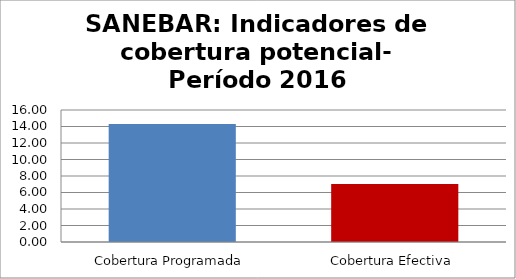
| Category | Series 0 |
|---|---|
| Cobertura Programada | 14.311 |
| Cobertura Efectiva | 7.016 |